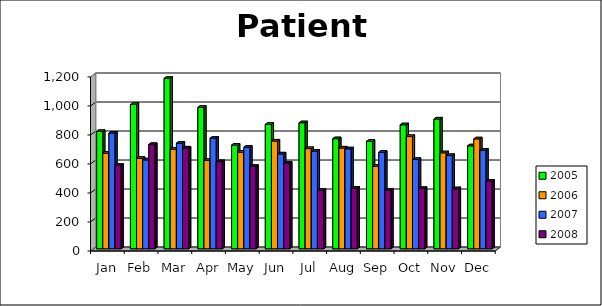
| Category | 2000 | 2001 | 2004 | 2005 | 2006 | 2007 | 2008 |
|---|---|---|---|---|---|---|---|
| Jan |  |  |  | 809 | 659 | 798 | 575 |
| Feb |  |  |  | 995 | 624 | 613 | 719 |
| Mar |  |  |  | 1175 | 687 | 728 | 695 |
| Apr |  |  |  | 975 | 609 | 762 | 601 |
| May |  |  |  | 715 | 666 | 700 | 568 |
| Jun |  |  |  | 858 | 743 | 654 | 591 |
| Jul |  |  |  | 869 | 691 | 673 | 404 |
| Aug |  |  |  | 759 | 695 | 689 | 418 |
| Sep |  |  |  | 741 | 569 | 665 | 405 |
| Oct |  |  |  | 855 | 774 | 616 | 416 |
| Nov |  |  |  | 895 | 662 | 643 | 414 |
| Dec |  |  |  | 710 | 758 | 680 | 466 |